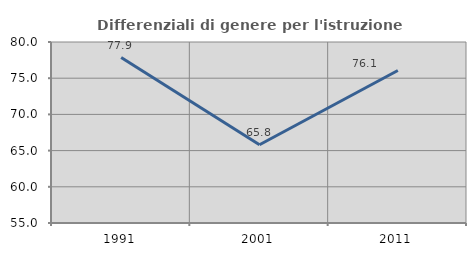
| Category | Differenziali di genere per l'istruzione superiore |
|---|---|
| 1991.0 | 77.851 |
| 2001.0 | 65.809 |
| 2011.0 | 76.068 |